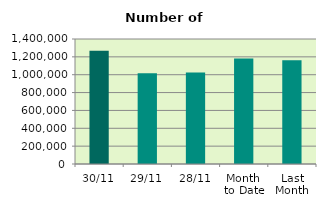
| Category | Series 0 |
|---|---|
| 30/11 | 1269494 |
| 29/11 | 1016426 |
| 28/11 | 1023522 |
| Month 
to Date | 1182027.273 |
| Last
Month | 1161301.714 |